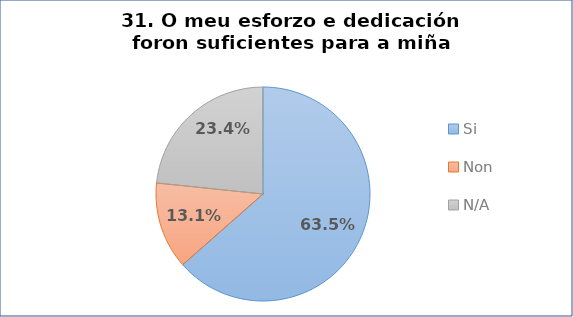
| Category | Pregunta 31. O meu esforzo e dedicación foron suficientes para a miña investigación |
|---|---|
| Si | 0.635 |
| Non | 0.131 |
| N/A | 0.234 |